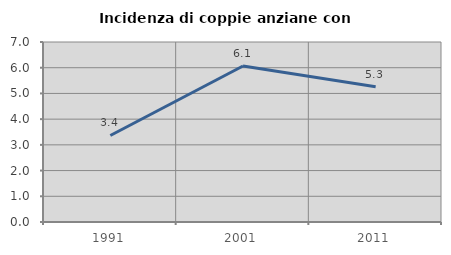
| Category | Incidenza di coppie anziane con figli |
|---|---|
| 1991.0 | 3.365 |
| 2001.0 | 6.067 |
| 2011.0 | 5.263 |